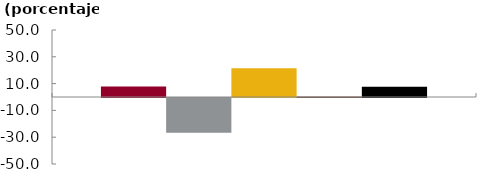
| Category | Bancos | CF | CFC | Coop | Sistema |
|---|---|---|---|---|---|
|  | 7.772 | -26.016 | 21.496 | 0.403 | 7.688 |